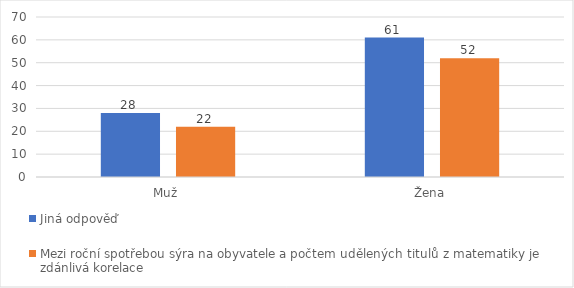
| Category | Jiná odpověď | Mezi roční spotřebou sýra na obyvatele a počtem udělených titulů z matematiky je zdánlivá korelace |
|---|---|---|
| Muž | 28 | 22 |
| Žena | 61 | 52 |